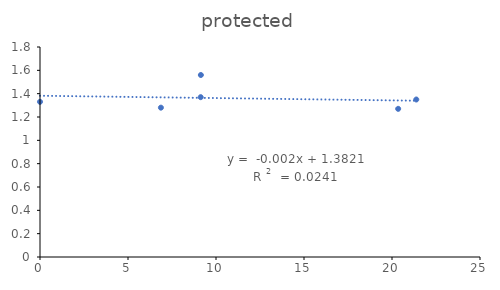
| Category | protected |
|---|---|
| 0.0 | 1.33 |
| 20.35 | 1.27 |
| 21.38 | 1.35 |
| 9.14 | 1.56 |
| 9.13 | 1.37 |
| 6.87 | 1.28 |